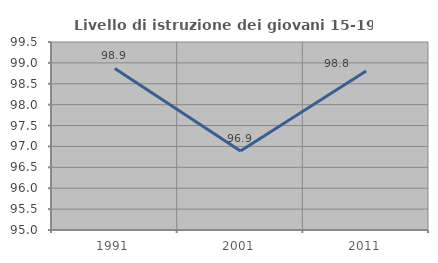
| Category | Livello di istruzione dei giovani 15-19 anni |
|---|---|
| 1991.0 | 98.867 |
| 2001.0 | 96.89 |
| 2011.0 | 98.806 |